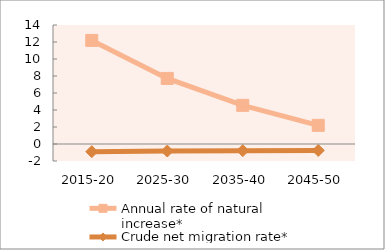
| Category | Annual rate of natural increase* | Crude net migration rate* |
|---|---|---|
| 2015-20 | 12.184 | -0.904 |
| 2025-30 | 7.714 | -0.826 |
| 2035-40 | 4.548 | -0.784 |
| 2045-50 | 2.194 | -0.764 |